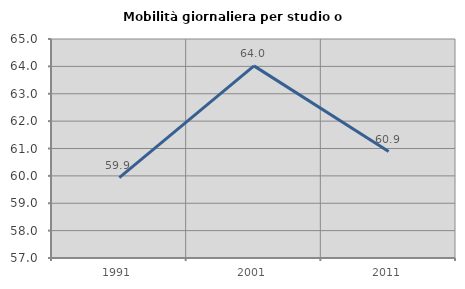
| Category | Mobilità giornaliera per studio o lavoro |
|---|---|
| 1991.0 | 59.938 |
| 2001.0 | 64.018 |
| 2011.0 | 60.889 |